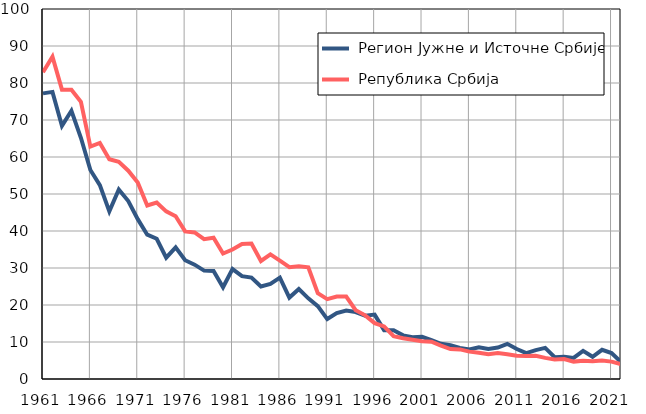
| Category |  Регион Јужне и Источне Србије |  Република Србија |
|---|---|---|
| 1961.0 | 77.2 | 82.9 |
| 1962.0 | 77.6 | 87.1 |
| 1963.0 | 68.4 | 78.2 |
| 1964.0 | 72.5 | 78.2 |
| 1965.0 | 65.2 | 74.9 |
| 1966.0 | 56.5 | 62.8 |
| 1967.0 | 52.4 | 63.8 |
| 1968.0 | 45.3 | 59.4 |
| 1969.0 | 51.2 | 58.7 |
| 1970.0 | 48.1 | 56.3 |
| 1971.0 | 43.2 | 53.1 |
| 1972.0 | 39 | 46.9 |
| 1973.0 | 37.9 | 47.7 |
| 1974.0 | 32.8 | 45.3 |
| 1975.0 | 35.6 | 44 |
| 1976.0 | 32.1 | 39.9 |
| 1977.0 | 30.9 | 39.6 |
| 1978.0 | 29.3 | 37.8 |
| 1979.0 | 29.2 | 38.2 |
| 1980.0 | 24.8 | 33.9 |
| 1981.0 | 29.7 | 35 |
| 1982.0 | 27.8 | 36.5 |
| 1983.0 | 27.4 | 36.6 |
| 1984.0 | 25 | 31.9 |
| 1985.0 | 25.7 | 33.7 |
| 1986.0 | 27.4 | 32 |
| 1987.0 | 22 | 30.2 |
| 1988.0 | 24.3 | 30.5 |
| 1989.0 | 21.8 | 30.2 |
| 1990.0 | 19.7 | 23.2 |
| 1991.0 | 16.2 | 21.6 |
| 1992.0 | 17.8 | 22.3 |
| 1993.0 | 18.5 | 22.3 |
| 1994.0 | 18.1 | 18.6 |
| 1995.0 | 17.1 | 17.2 |
| 1996.0 | 17.4 | 15.1 |
| 1997.0 | 13.2 | 14.2 |
| 1998.0 | 13.2 | 11.6 |
| 1999.0 | 11.8 | 11 |
| 2000.0 | 11.3 | 10.6 |
| 2001.0 | 11.4 | 10.2 |
| 2002.0 | 10.5 | 10.1 |
| 2003.0 | 9.5 | 9 |
| 2004.0 | 9.1 | 8.1 |
| 2005.0 | 8.4 | 8 |
| 2006.0 | 8 | 7.4 |
| 2007.0 | 8.6 | 7.1 |
| 2008.0 | 8.1 | 6.7 |
| 2009.0 | 8.5 | 7 |
| 2010.0 | 9.5 | 6.7 |
| 2011.0 | 8.1 | 6.3 |
| 2012.0 | 7 | 6.2 |
| 2013.0 | 7.8 | 6.3 |
| 2014.0 | 8.4 | 5.7 |
| 2015.0 | 5.9 | 5.3 |
| 2016.0 | 6 | 5.4 |
| 2017.0 | 5.7 | 4.7 |
| 2018.0 | 7.6 | 4.9 |
| 2019.0 | 6 | 4.8 |
| 2020.0 | 7.9 | 5 |
| 2021.0 | 7 | 4.7 |
| 2022.0 | 4.6 | 4 |